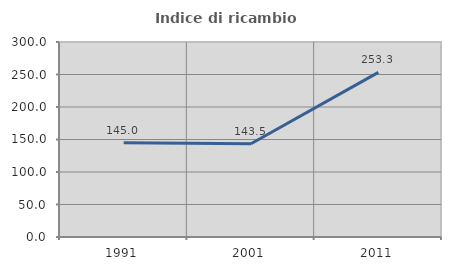
| Category | Indice di ricambio occupazionale  |
|---|---|
| 1991.0 | 145 |
| 2001.0 | 143.478 |
| 2011.0 | 253.333 |